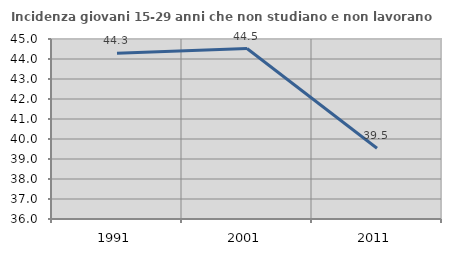
| Category | Incidenza giovani 15-29 anni che non studiano e non lavorano  |
|---|---|
| 1991.0 | 44.282 |
| 2001.0 | 44.525 |
| 2011.0 | 39.537 |